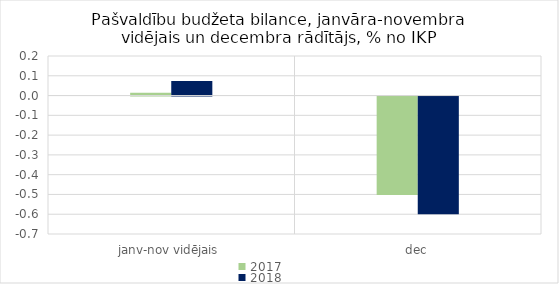
| Category | 2017 | 2018 |
|---|---|---|
| janv-nov vidējais | 0.015 | 0.074 |
| dec | -0.497 | -0.596 |